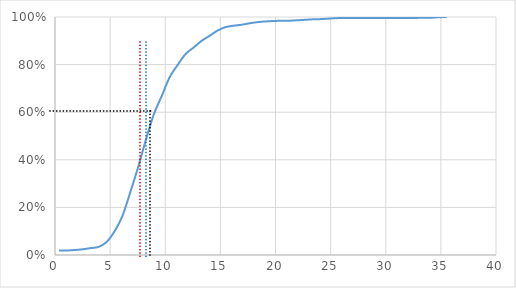
| Category | Series 0 |
|---|---|
| 0.351856389130132 | 0.019 |
| 1.06993065266101 | 0.019 |
| 1.78800491619189 | 0.021 |
| 2.50607917972277 | 0.024 |
| 3.22415344325365 | 0.029 |
| 3.94222770678454 | 0.034 |
| 4.66030197031542 | 0.054 |
| 5.3783762338463 | 0.098 |
| 6.09645049737718 | 0.162 |
| 6.81452476090806 | 0.261 |
| 7.53259902443895 | 0.368 |
| 8.25067328796983 | 0.485 |
| 8.96874755150071 | 0.592 |
| 9.68682181503159 | 0.669 |
| 10.4048960785624 | 0.748 |
| 11.1229703420933 | 0.798 |
| 11.8410446056242 | 0.844 |
| 12.5591188691551 | 0.871 |
| 13.277193132686 | 0.899 |
| 13.9952673962168 | 0.92 |
| 14.7133416597477 | 0.942 |
| 15.4314159232786 | 0.957 |
| 16.1494901868095 | 0.963 |
| 16.8675644503404 | 0.967 |
| 17.5856387138712 | 0.973 |
| 18.3037129774021 | 0.978 |
| 19.021787240933 | 0.981 |
| 19.7398615044639 | 0.983 |
| 20.4579357679948 | 0.984 |
| 21.1760100315257 | 0.984 |
| 21.8940842950565 | 0.986 |
| 22.6121585585874 | 0.988 |
| 23.3302328221183 | 0.99 |
| 24.0483070856492 | 0.991 |
| 24.7663813491801 | 0.993 |
| 25.4844556127109 | 0.995 |
| 26.2025298762418 | 0.996 |
| 26.9206041397727 | 0.996 |
| 27.6386784033036 | 0.996 |
| 28.3567526668345 | 0.996 |
| 29.0748269303654 | 0.996 |
| 29.7929011938962 | 0.996 |
| 30.5109754574271 | 0.996 |
| 31.229049720958 | 0.996 |
| 31.9471239844889 | 0.996 |
| 32.6651982480198 | 0.996 |
| 33.3832725115506 | 0.997 |
| 34.1013467750815 | 0.997 |
| 34.8194210386124 | 0.999 |
| 35.5374953021433 | 1 |